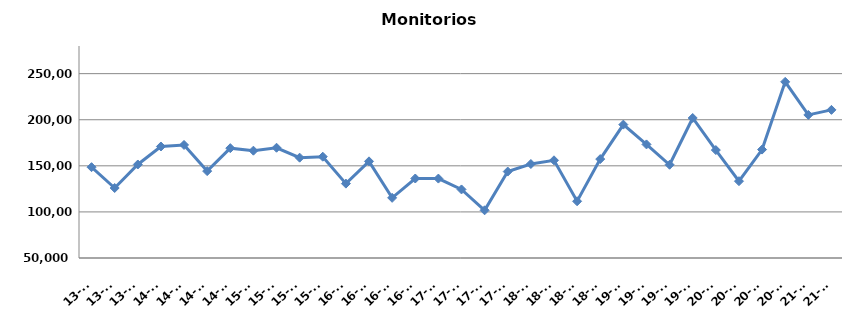
| Category | Monitorios ingresados |
|---|---|
| 13-T2 | 148525 |
| 13-T3 | 125943 |
| 13-T4 | 151448 |
| 14-T1 | 170973 |
| 14-T2 | 172648 |
| 14-T3 | 144262 |
| 14-T4 | 169174 |
| 15-T1 | 166433 |
| 15-T2 | 169612 |
| 15-T3 | 158859 |
| 15-T4 | 159890 |
| 16-T1 | 130680 |
| 16-T2 | 154860 |
| 16-T3 | 115269 |
| 16-T4 | 136245 |
| 17-T1 | 136155 |
| 17-T2 | 124382 |
| 17-T3 | 101751 |
| 17-T4 | 143788 |
| 18-T1 | 151974 |
| 18-T2 | 155991 |
| 18-T3 | 111544 |
| 18-T4 | 157337 |
| 19-T1 | 194715 |
| 19-T2 | 173225 |
| 19-T3 | 151156 |
| 19-T4 | 201895 |
| 20-T1 | 167095 |
| 20-T2 | 133351 |
| 20-T3 | 167630 |
| 20-T4 | 241119 |
| 21-T1 | 205212 |
| 21-T2 | 210707 |